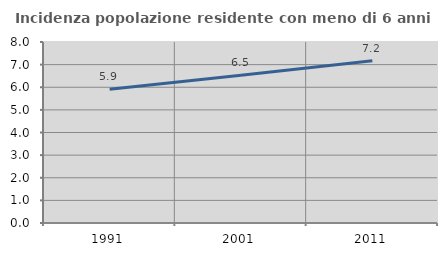
| Category | Incidenza popolazione residente con meno di 6 anni |
|---|---|
| 1991.0 | 5.915 |
| 2001.0 | 6.528 |
| 2011.0 | 7.172 |